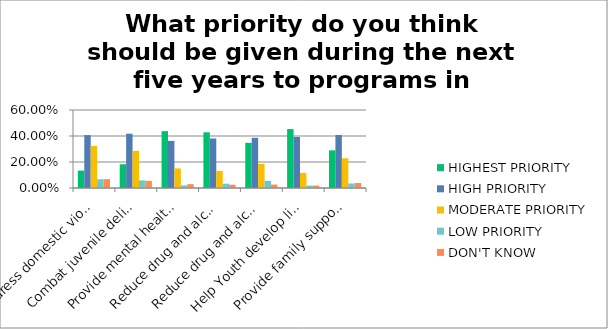
| Category | HIGHEST PRIORITY | HIGH PRIORITY | MODERATE PRIORITY | LOW PRIORITY | DON'T KNOW |
|---|---|---|---|---|---|
| Address domestic violence or abuse? | 0.134 | 0.407 | 0.324 | 0.067 | 0.068 |
| Combat juvenile delinquency? | 0.182 | 0.418 | 0.286 | 0.058 | 0.055 |
| Provide mental health services? | 0.437 | 0.362 | 0.151 | 0.02 | 0.03 |
| Reduce drug and alcohol use among youth? | 0.429 | 0.381 | 0.132 | 0.033 | 0.025 |
| Reduce drug and alcohol use among adults? | 0.347 | 0.386 | 0.185 | 0.055 | 0.026 |
| Help Youth develop life skills? | 0.453 | 0.392 | 0.117 | 0.019 | 0.019 |
| Provide family support services? | 0.29 | 0.408 | 0.229 | 0.035 | 0.038 |